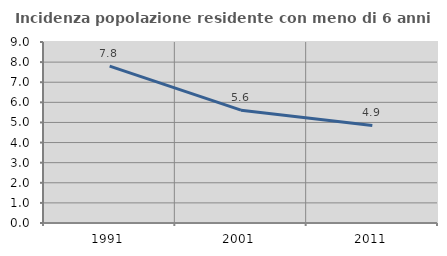
| Category | Incidenza popolazione residente con meno di 6 anni |
|---|---|
| 1991.0 | 7.802 |
| 2001.0 | 5.611 |
| 2011.0 | 4.851 |